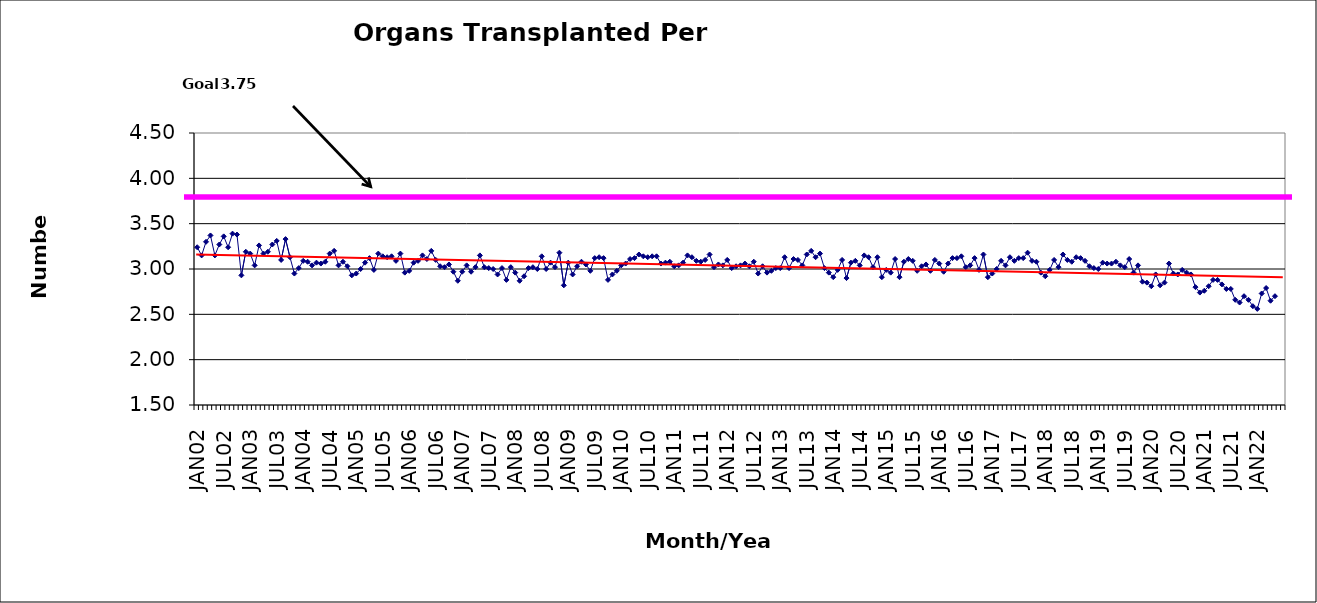
| Category | Series 0 |
|---|---|
| JAN02 | 3.24 |
| FEB02 | 3.15 |
| MAR02 | 3.3 |
| APR02 | 3.37 |
| MAY02 | 3.15 |
| JUN02 | 3.27 |
| JUL02 | 3.36 |
| AUG02 | 3.24 |
| SEP02 | 3.39 |
| OCT02 | 3.38 |
| NOV02 | 2.93 |
| DEC02 | 3.19 |
| JAN03 | 3.17 |
| FEB03 | 3.04 |
| MAR03 | 3.26 |
| APR03 | 3.17 |
| MAY03 | 3.19 |
| JUN03 | 3.27 |
| JUL03 | 3.31 |
| AUG03 | 3.1 |
| SEP03 | 3.33 |
| OCT03 | 3.13 |
| NOV03 | 2.95 |
| DEC03 | 3.01 |
| JAN04 | 3.09 |
| FEB04 | 3.08 |
| MAR04 | 3.04 |
| APR04 | 3.07 |
| MAY04 | 3.06 |
| JUN04 | 3.08 |
| JUL04 | 3.17 |
| AUG04 | 3.2 |
| SEP04 | 3.04 |
| OCT04 | 3.08 |
| NOV04 | 3.03 |
| DEC04 | 2.93 |
| JAN05 | 2.95 |
| FEB05 | 3 |
| MAR05 | 3.07 |
| APR05 | 3.12 |
| MAY05 | 2.99 |
| JUN05 | 3.17 |
| JUL05 | 3.14 |
| AUG05 | 3.13 |
| SEP05 | 3.14 |
| OCT05 | 3.09 |
| NOV05 | 3.17 |
| DEC05 | 2.96 |
| JAN06 | 2.98 |
| FEB06 | 3.07 |
| MAR06 | 3.09 |
| APR06 | 3.15 |
| MAY06 | 3.11 |
| JUN06 | 3.2 |
| JUL06 | 3.1 |
| AUG06 | 3.03 |
| SEP06 | 3.02 |
| OCT06 | 3.05 |
| NOV06 | 2.97 |
| DEC06 | 2.87 |
| JAN07 | 2.97 |
| FEB07 | 3.04 |
| MAR07 | 2.97 |
| APR07 | 3.02 |
| MAY07 | 3.15 |
| JUN07 | 3.02 |
| JUL07 | 3.01 |
| AUG07 | 3 |
| SEP07 | 2.94 |
| OCT07 | 3.01 |
| NOV07 | 2.88 |
| DEC07 | 3.02 |
| JAN08 | 2.96 |
| FEB08 | 2.87 |
| MAR08 | 2.92 |
| APR08 | 3.01 |
| MAY08 | 3.02 |
| JUN08 | 3 |
| JUL08 | 3.14 |
| AUG08 | 3 |
| SEP08 | 3.07 |
| OCT08 | 3.02 |
| NOV08 | 3.18 |
| DEC08 | 2.82 |
| JAN09 | 3.07 |
| FEB09 | 2.94 |
| MAR09 | 3.03 |
| APR09 | 3.08 |
| MAY09 | 3.05 |
| JUN09 | 2.98 |
| JUL09 | 3.12 |
| AUG09 | 3.13 |
| SEP09 | 3.12 |
| OCT09 | 2.88 |
| NOV09 | 2.94 |
| DEC09 | 2.98 |
| JAN10 | 3.04 |
| FEB10 | 3.06 |
| MAR10 | 3.11 |
| APR10 | 3.12 |
| MAY10 | 3.16 |
| JUN10 | 3.14 |
| JUL10 | 3.13 |
| AUG10 | 3.14 |
| SEP10 | 3.14 |
| OCT10 | 3.06 |
| NOV10 | 3.07 |
| DEC10 | 3.08 |
| JAN11 | 3.03 |
| FEB11 | 3.04 |
| MAR11 | 3.07 |
| APR11 | 3.15 |
| MAY11 | 3.13 |
| JUN11 | 3.09 |
| JUL11 | 3.08 |
| AUG11 | 3.1 |
| SEP11 | 3.16 |
| OCT11 | 3.02 |
| NOV11 | 3.05 |
| DEC11 | 3.04 |
| JAN12 | 3.1 |
| FEB12 | 3.01 |
| MAR12 | 3.03 |
| APR12 | 3.04 |
| MAY12 | 3.06 |
| JUN12 | 3.03 |
| JUL12 | 3.08 |
| AUG12 | 2.95 |
| SEP12 | 3.03 |
| OCT12 | 2.96 |
| NOV12 | 2.98 |
| DEC12 | 3.01 |
| JAN13 | 3.01 |
| FEB13 | 3.13 |
| MAR13 | 3.01 |
| APR13 | 3.11 |
| MAY13 | 3.1 |
| JUN13 | 3.04 |
| JUL13 | 3.16 |
| AUG13 | 3.2 |
| SEP13 | 3.13 |
| OCT13 | 3.17 |
| NOV13 | 3.01 |
| DEC13 | 2.96 |
| JAN14 | 2.91 |
| FEB14 | 2.99 |
| MAR14 | 3.1 |
| APR14 | 2.9 |
| MAY14 | 3.07 |
| JUN14 | 3.09 |
| JUL14 | 3.04 |
| AUG14 | 3.15 |
| SEP14 | 3.13 |
| OCT14 | 3.02 |
| NOV14 | 3.13 |
| DEC14 | 2.91 |
| JAN15 | 2.99 |
| FEB15 | 2.96 |
| MAR15 | 3.11 |
| APR15 | 2.91 |
| MAY15 | 3.08 |
| JUN15 | 3.11 |
| JUL15 | 3.09 |
| AUG15 | 2.98 |
| SEP15 | 3.03 |
| OCT15 | 3.05 |
| NOV15 | 2.98 |
| DEC15 | 3.1 |
| JAN16 | 3.06 |
| FEB16 | 2.97 |
| MAR16 | 3.06 |
| APR16 | 3.12 |
| MAY16 | 3.12 |
| JUN16 | 3.14 |
| JUL16 | 3.02 |
| AUG16 | 3.04 |
| SEP16 | 3.12 |
| OCT16 | 2.99 |
| NOV16 | 3.16 |
| DEC16 | 2.91 |
| JAN17 | 2.95 |
| FEB17 | 3 |
| MAR17 | 3.09 |
| APR17 | 3.04 |
| MAY17 | 3.13 |
| JUN17 | 3.09 |
| JUL17 | 3.12 |
| AUG17 | 3.12 |
| SEP17 | 3.18 |
| OCT17 | 3.09 |
| NOV17 | 3.08 |
| DEC17 | 2.96 |
| JAN18 | 2.92 |
| FEB18 | 2.99 |
| MAR18 | 3.1 |
| APR18 | 3.02 |
| MAY18 | 3.16 |
| JUN18 | 3.1 |
| JUL18 | 3.08 |
| AUG18 | 3.13 |
| SEP18 | 3.12 |
| OCT18 | 3.09 |
| NOV18 | 3.03 |
| DEC18 | 3.01 |
| JAN19 | 3 |
| FEB19 | 3.07 |
| MAR19 | 3.06 |
| APR19 | 3.06 |
| MAY19 | 3.08 |
| JUN19 | 3.04 |
| JUL19 | 3.02 |
| AUG19 | 3.11 |
| SEP19 | 2.96 |
| OCT19 | 3.04 |
| NOV19 | 2.86 |
| DEC19 | 2.85 |
| JAN20 | 2.81 |
| FEB20 | 2.94 |
| MAR20 | 2.82 |
| APR20 | 2.85 |
| MAY20 | 3.06 |
| JUN20 | 2.95 |
| JUL20 | 2.94 |
| AUG20 | 2.99 |
| SEP20 | 2.96 |
| OCT20 | 2.94 |
| NOV20 | 2.8 |
| DEC20 | 2.74 |
| JAN21 | 2.76 |
| FEB21 | 2.81 |
| MAR21 | 2.88 |
| APR21 | 2.88 |
| MAY21 | 2.83 |
| JUN21 | 2.78 |
| JUL21 | 2.78 |
| AUG21 | 2.66 |
| SEP21 | 2.63 |
| OCT21 | 2.7 |
| NOV21 | 2.66 |
| DEC21 | 2.59 |
| JAN22 | 2.56 |
| FEB22 | 2.73 |
| MAR22 | 2.79 |
| APR22 | 2.65 |
| MAY22 | 2.7 |